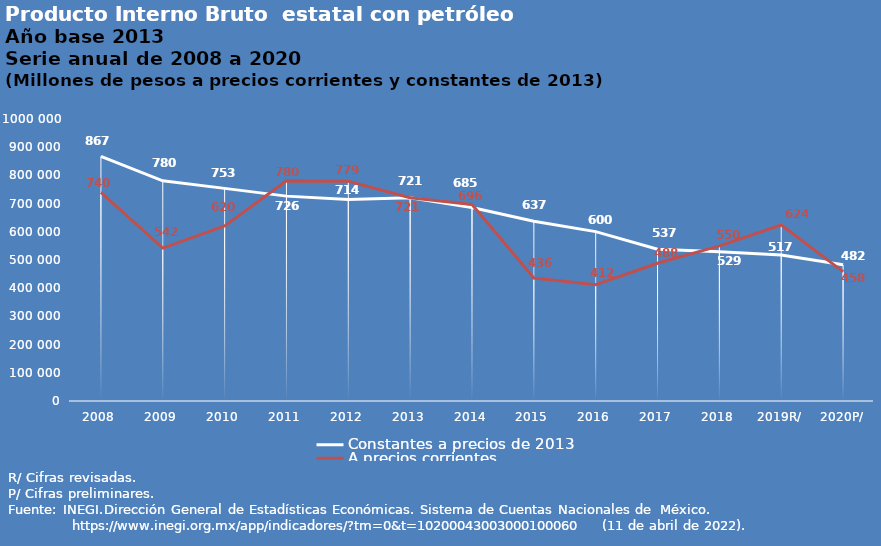
| Category | Constantes a precios de 2013 | A precios corrientes |
|---|---|---|
| 2008 | 867231.044 | 740140.02 |
| 2009 | 780757.429 | 542318.291 |
| 2010 | 753968.591 | 620535.423 |
| 2011 | 726503.856 | 780750.71 |
| 2012 | 714787.065 | 779041.23 |
| 2013 | 721085.063 | 721085.063 |
| 2014 | 685981.27 | 696682.543 |
| 2015 | 637604.643 | 436081.494 |
| 2016 | 600612.272 | 412424.333 |
| 2017 | 537882.577 | 488348.95 |
| 2018 | 529465.695 | 550190.707 |
| 2019R/ | 517311.384 | 624209.886 |
| 2020P/ | 482973.093 | 458928.004 |